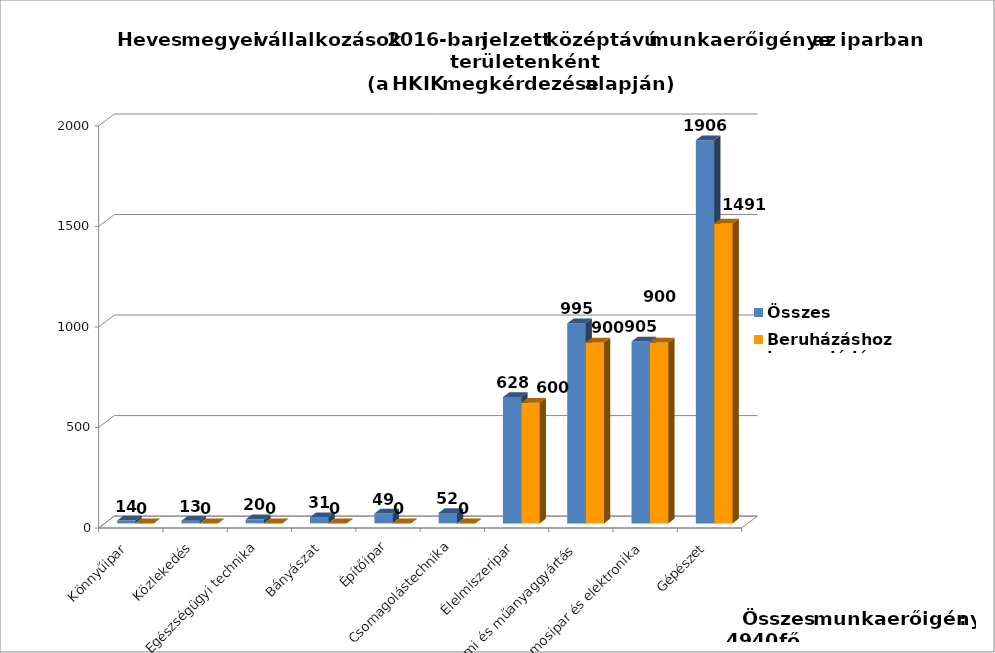
| Category | Összes | Beruházáshoz kapcsolódó |
|---|---|---|
| Könnyűipar | 14 | 0 |
| Közlekedés | 13 | 0 |
| Egészségügyi technika | 20 | 0 |
| Bányászat | 31 | 0 |
| Építőipar | 49 | 0 |
| Csomagolástechnika | 52 | 0 |
| Élelmiszeripar | 628 | 600 |
| Gumi és műanyaggyártás | 995 | 900 |
| Villamosipar és elektronika | 905 | 900 |
| Gépészet | 1906 | 1491 |